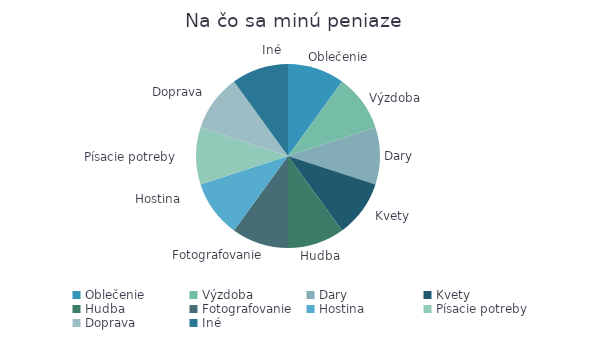
| Category | Suma |
|---|---|
| Oblečenie | 1 |
| Výzdoba | 1 |
| Dary | 1 |
| Kvety | 1 |
| Hudba | 1 |
| Fotografovanie | 1 |
| Hostina | 1 |
| Písacie potreby | 1 |
| Doprava | 1 |
| Iné | 1 |